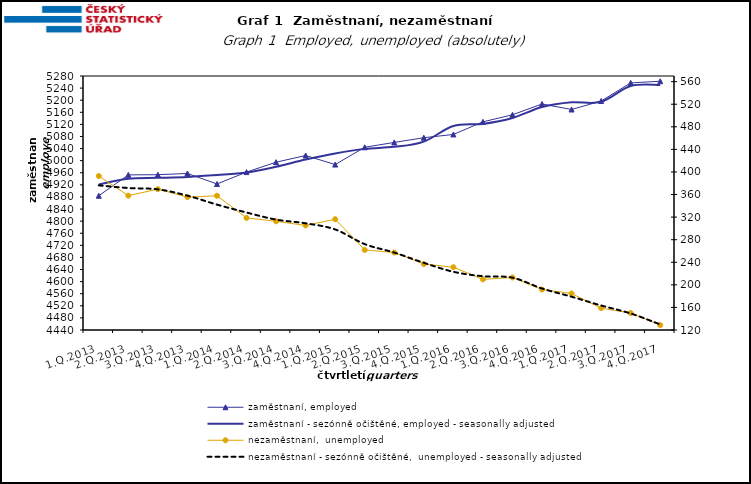
| Category | zaměstnaní, employed | zaměstnaní - sezónně očištěné, employed - seasonally adjusted |
|---|---|---|
| 1.Q.2013 | 4884.025 | 4921.298 |
| 2.Q.2013 | 4952.991 | 4940.38 |
| 3.Q.2013 | 4953.606 | 4943.118 |
| 4.Q.2013 | 4957.713 | 4946.225 |
| 1.Q.2014 | 4922.963 | 4952.405 |
| 2.Q.2014 | 4962.219 | 4960.65 |
| 3.Q.2014 | 4994.947 | 4979.618 |
| 4.Q.2014 | 5017.051 | 5003.629 |
| 1.Q.2015 | 4987.141 | 5023.827 |
| 2.Q.2015 | 5044.285 | 5038.984 |
| 3.Q.2015 | 5060.3 | 5045.647 |
| 4.Q.2015 | 5075.884 | 5063.085 |
| 1.Q.2016 | 5086.671 | 5114.698 |
| 2.Q.2016 | 5128.493 | 5121.602 |
| 3.Q.2016 | 5151.712 | 5140.967 |
| 4.Q.2016 | 5187.436 | 5177.35 |
| 1.Q.2017 | 5169.203 | 5192.941 |
| 2.Q.2017 | 5197.265 | 5194.555 |
| 3.Q.2017 | 5257.26 | 5246.726 |
| 4.Q.2017 | 5262.691 | 5250.237 |